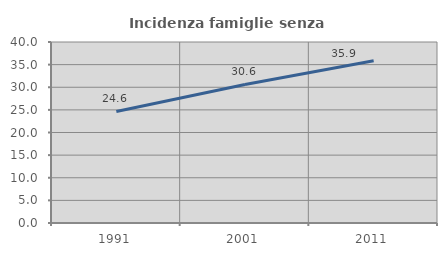
| Category | Incidenza famiglie senza nuclei |
|---|---|
| 1991.0 | 24.648 |
| 2001.0 | 30.623 |
| 2011.0 | 35.86 |